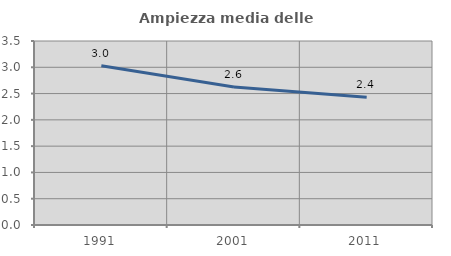
| Category | Ampiezza media delle famiglie |
|---|---|
| 1991.0 | 3.029 |
| 2001.0 | 2.626 |
| 2011.0 | 2.432 |